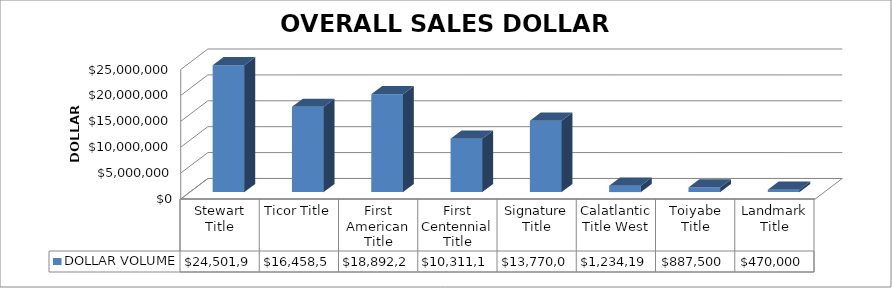
| Category | DOLLAR VOLUME |
|---|---|
| Stewart Title | 24501934 |
| Ticor Title | 16458599 |
| First American Title | 18892250 |
| First Centennial Title | 10311142.5 |
| Signature Title | 13770000 |
| Calatlantic Title West | 1234190 |
| Toiyabe Title | 887500 |
| Landmark Title | 470000 |